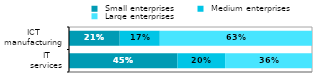
| Category |  Small enterprises |  Medium enterprises |  Large enterprises |
|---|---|---|---|
|  IT 
services | 0.446 | 0.196 | 0.358 |
|  ICT 
manufacturing | 0.209 | 0.165 | 0.626 |